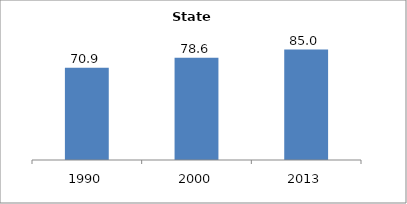
| Category | Series 0 |
|---|---|
| 1990.0 | 70.925 |
| 2000.0 | 78.57 |
| 2013.0 | 84.962 |